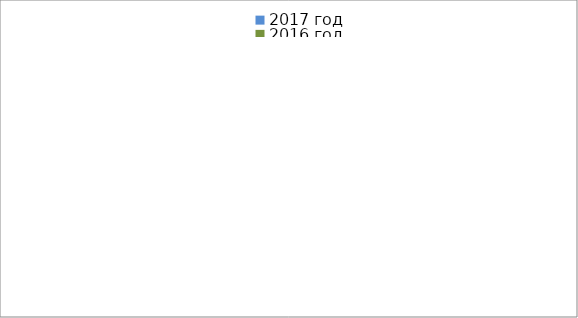
| Category | 2017 год | 2016 год |
|---|---|---|
|  - поджог | 2 | 19 |
|  - неосторожное обращение с огнём | 1 | 12 |
|  - НПТЭ электрооборудования | 3 | 2 |
|  - НПУ и Э печей | 15 | 14 |
|  - НПУ и Э транспортных средств | 20 | 9 |
|   -Шалость с огнем детей | 1 | 2 |
|  -НППБ при эксплуатации эл.приборов | 13 | 2 |
|  - курение | 13 | 1 |
| - прочие | 25 | 31 |
| - не установленные причины | 0 | 9 |